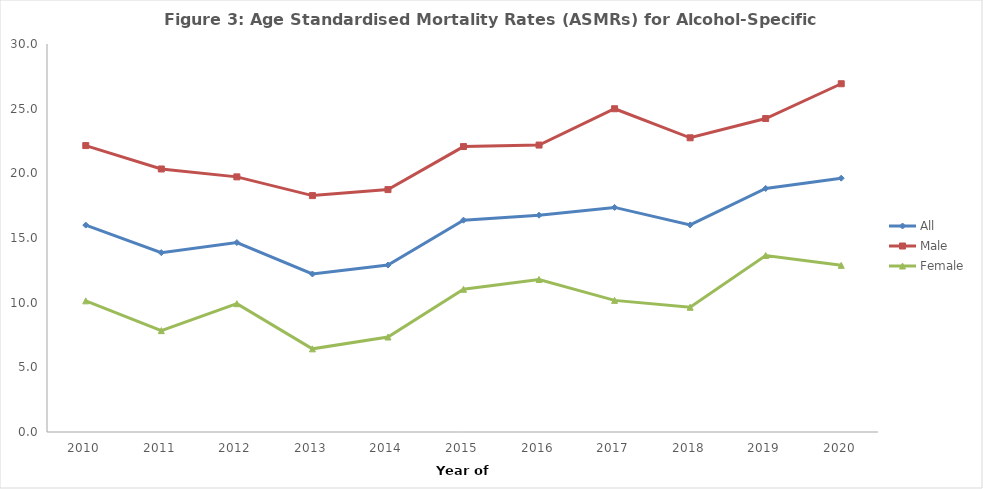
| Category | All | Male | Female |
|---|---|---|---|
| 2010 | 15.998 | 22.146 | 10.141 |
| 2011 | 13.867 | 20.337 | 7.838 |
| 2012 | 14.647 | 19.726 | 9.92 |
| 2013 | 12.217 | 18.279 | 6.43 |
| 2014 | 12.908 | 18.742 | 7.344 |
| 2015 | 16.376 | 22.069 | 11.034 |
| 2016 | 16.763 | 22.187 | 11.793 |
| 2017 | 17.366 | 24.995 | 10.177 |
| 2018 | 16.011 | 22.748 | 9.642 |
| 2019 | 18.83 | 24.237 | 13.648 |
| 2020 | 19.626 | 26.927 | 12.885 |